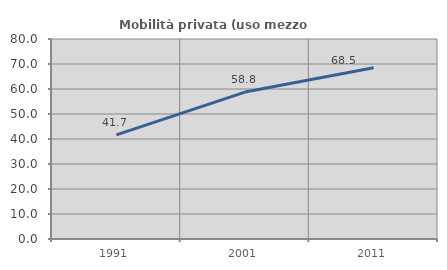
| Category | Mobilità privata (uso mezzo privato) |
|---|---|
| 1991.0 | 41.68 |
| 2001.0 | 58.765 |
| 2011.0 | 68.496 |